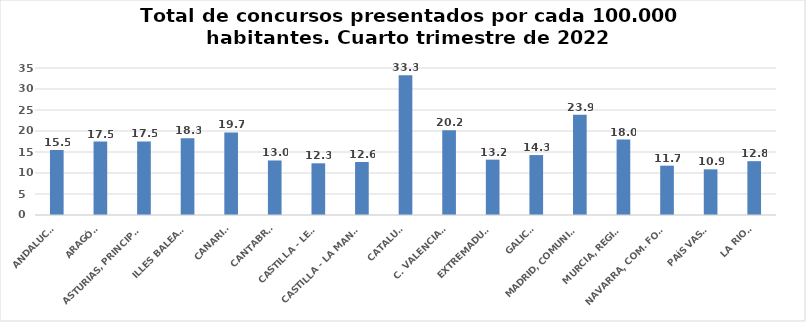
| Category | Series 0 |
|---|---|
| ANDALUCÍA | 15.504 |
| ARAGÓN | 17.492 |
| ASTURIAS, PRINCIPADO | 17.518 |
| ILLES BALEARS | 18.272 |
| CANARIAS | 19.654 |
| CANTABRIA | 12.983 |
| CASTILLA - LEÓN | 12.307 |
| CASTILLA - LA MANCHA | 12.614 |
| CATALUÑA | 33.288 |
| C. VALENCIANA | 20.204 |
| EXTREMADURA | 13.178 |
| GALICIA | 14.273 |
| MADRID, COMUNIDAD | 23.895 |
| MURCIA, REGIÓN | 17.952 |
| NAVARRA, COM. FORAL | 11.745 |
| PAÍS VASCO | 10.869 |
| LA RIOJA | 12.817 |